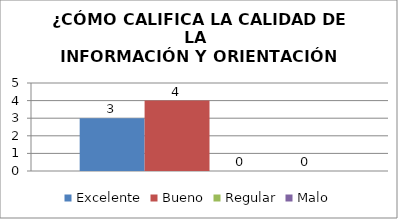
| Category | Excelente | Bueno | Regular | Malo |
|---|---|---|---|---|
| 0 | 3 | 4 | 0 | 0 |